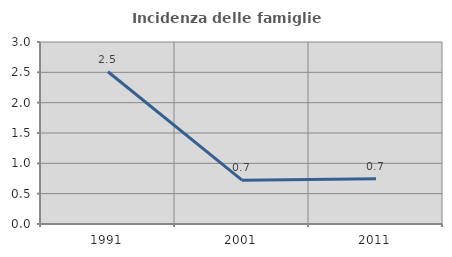
| Category | Incidenza delle famiglie numerose |
|---|---|
| 1991.0 | 2.51 |
| 2001.0 | 0.722 |
| 2011.0 | 0.745 |